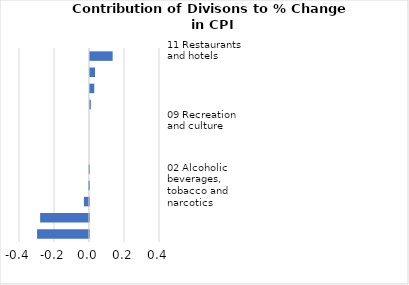
| Category |     Contributions |
|---|---|
| 11 Restaurants and hotels | 0.129 |
| 05 Furnishings, household equipment and maintenance | 0.029 |
| 03 Clothing and footwear | 0.024 |
| 12 Miscellaneous goods and services | 0.005 |
| 09 Recreation and culture | 0 |
| 10 Education | 0 |
| 06 Health | 0 |
| 08 Communication | -0.003 |
| 02 Alcoholic beverages, tobacco and narcotics | -0.005 |
| 04 Housing, water, electricity, gas and other fuels | -0.029 |
| 01 Food and non-alcoholic beverages | -0.279 |
| 07 Transport | -0.297 |